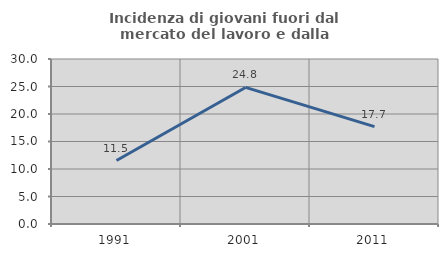
| Category | Incidenza di giovani fuori dal mercato del lavoro e dalla formazione  |
|---|---|
| 1991.0 | 11.544 |
| 2001.0 | 24.83 |
| 2011.0 | 17.704 |